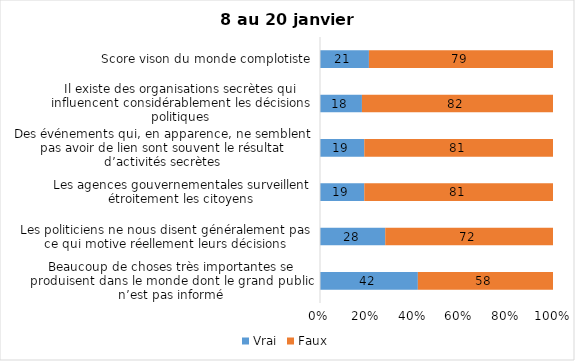
| Category | Vrai | Faux |
|---|---|---|
| Beaucoup de choses très importantes se produisent dans le monde dont le grand public n’est pas informé | 42 | 58 |
| Les politiciens ne nous disent généralement pas ce qui motive réellement leurs décisions | 28 | 72 |
| Les agences gouvernementales surveillent étroitement les citoyens | 19 | 81 |
| Des événements qui, en apparence, ne semblent pas avoir de lien sont souvent le résultat d’activités secrètes | 19 | 81 |
| Il existe des organisations secrètes qui influencent considérablement les décisions politiques | 18 | 82 |
| Score vison du monde complotiste | 21 | 79 |